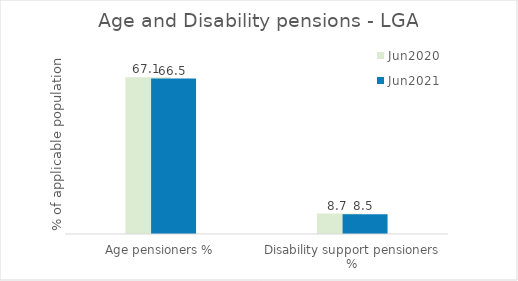
| Category | Jun2020 | Jun2021 |
|---|---|---|
| Age pensioners % | 67.053 | 66.514 |
| Disability support pensioners % | 8.729 | 8.5 |